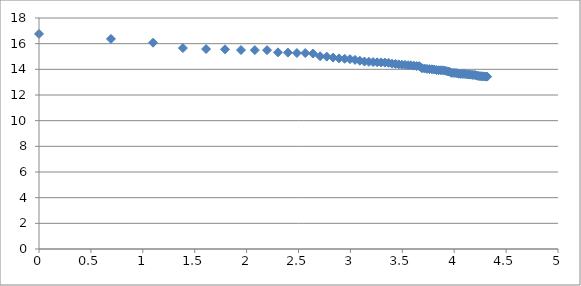
| Category | Series 0 |
|---|---|
| 0.0 | 16.76 |
| 0.6931471805599453 | 16.371 |
| 1.0986122886681098 | 16.074 |
| 1.3862943611198906 | 15.656 |
| 1.6094379124341003 | 15.58 |
| 1.791759469228055 | 15.561 |
| 1.9459101490553132 | 15.505 |
| 2.0794415416798357 | 15.498 |
| 2.1972245773362196 | 15.494 |
| 2.302585092994046 | 15.325 |
| 2.3978952727983707 | 15.303 |
| 2.4849066497880004 | 15.27 |
| 2.5649493574615367 | 15.268 |
| 2.6390573296152584 | 15.23 |
| 2.70805020110221 | 15.023 |
| 2.772588722239781 | 14.988 |
| 2.833213344056216 | 14.914 |
| 2.8903717578961645 | 14.851 |
| 2.9444389791664403 | 14.821 |
| 2.995732273553991 | 14.797 |
| 3.044522437723423 | 14.734 |
| 3.091042453358316 | 14.67 |
| 3.1354942159291497 | 14.607 |
| 3.1780538303479458 | 14.583 |
| 3.2188758248682006 | 14.562 |
| 3.258096538021482 | 14.552 |
| 3.295836866004329 | 14.536 |
| 3.332204510175204 | 14.524 |
| 3.367295829986474 | 14.51 |
| 3.4011973816621555 | 14.439 |
| 3.4339872044851463 | 14.414 |
| 3.4657359027997265 | 14.388 |
| 3.4965075614664802 | 14.355 |
| 3.5263605246161616 | 14.347 |
| 3.5553480614894135 | 14.321 |
| 3.58351893845611 | 14.318 |
| 3.6109179126442243 | 14.286 |
| 3.6375861597263857 | 14.254 |
| 3.6635616461296463 | 14.253 |
| 3.6888794541139363 | 14.088 |
| 3.713572066704308 | 14.067 |
| 3.7376696182833684 | 14.034 |
| 3.7612001156935624 | 14.019 |
| 3.784189633918261 | 14.003 |
| 3.8066624897703196 | 13.99 |
| 3.828641396489095 | 13.941 |
| 3.8501476017100584 | 13.933 |
| 3.871201010907891 | 13.927 |
| 3.8918202981106265 | 13.925 |
| 3.912023005428146 | 13.901 |
| 3.9318256327243257 | 13.849 |
| 3.9512437185814275 | 13.827 |
| 3.970291913552122 | 13.728 |
| 3.9889840465642745 | 13.72 |
| 4.007333185232471 | 13.716 |
| 4.02535169073515 | 13.705 |
| 4.04305126783455 | 13.658 |
| 4.060443010546419 | 13.648 |
| 4.07753744390572 | 13.648 |
| 4.0943445622221 | 13.639 |
| 4.110873864173311 | 13.637 |
| 4.127134385045092 | 13.603 |
| 4.143134726391533 | 13.593 |
| 4.1588830833596715 | 13.59 |
| 4.174387269895637 | 13.569 |
| 4.189654742026425 | 13.563 |
| 4.204692619390966 | 13.554 |
| 4.219507705176107 | 13.507 |
| 4.23410650459726 | 13.481 |
| 4.248495242049359 | 13.474 |
| 4.2626798770413155 | 13.458 |
| 4.276666119016055 | 13.457 |
| 4.290459441148391 | 13.44 |
| 4.30406509320417 | 13.434 |
| 4.31748811353631 | 13.432 |